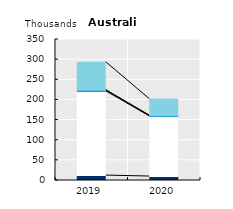
| Category | International seasonal workers | Working holidaymakers | Intra-company transferees | International trainees | Other temporary migrant workers |
|---|---|---|---|---|---|
| 2019.0 | 12.202 | 209.036 | 2.839 |  | 69.313 |
| 2020.0 | 9.823 | 149.249 | 1.84 |  | 41.018 |